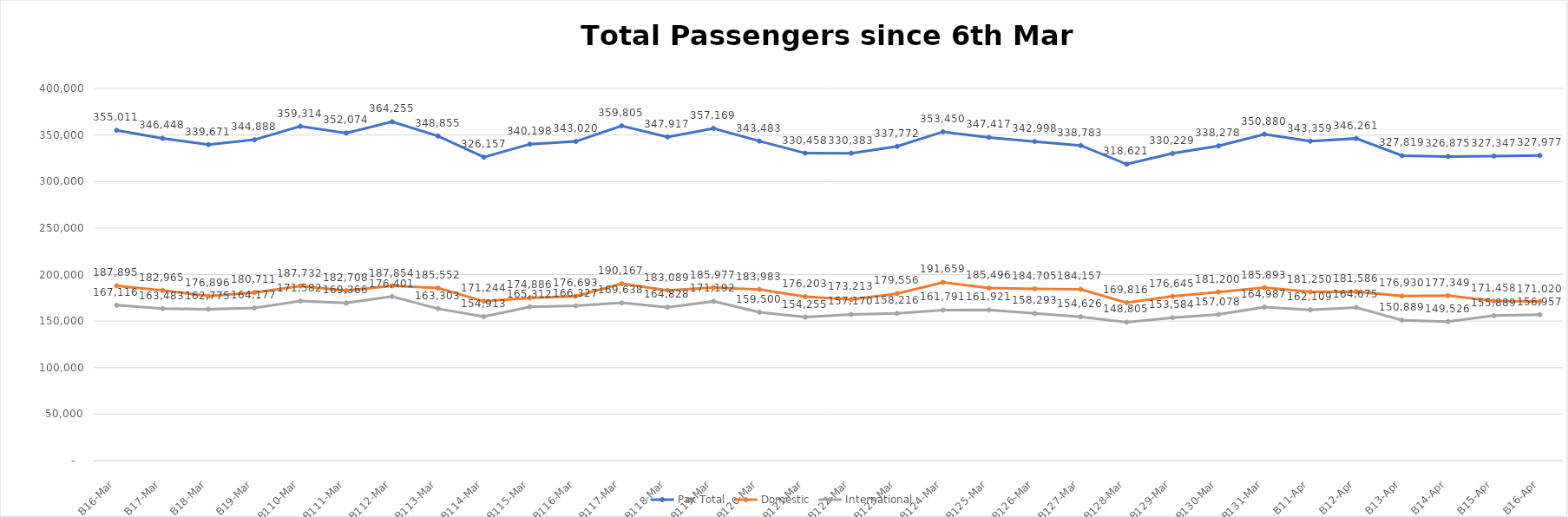
| Category | Pax Total |  Domestic  |  International  |
|---|---|---|---|
| 2023-03-06 | 355011 | 187895 | 167116 |
| 2023-03-07 | 346448 | 182965 | 163483 |
| 2023-03-08 | 339671 | 176896 | 162775 |
| 2023-03-09 | 344888 | 180711 | 164177 |
| 2023-03-10 | 359314 | 187732 | 171582 |
| 2023-03-11 | 352074 | 182708 | 169366 |
| 2023-03-12 | 364255 | 187854 | 176401 |
| 2023-03-13 | 348855 | 185552 | 163303 |
| 2023-03-14 | 326157 | 171244 | 154913 |
| 2023-03-15 | 340198 | 174886 | 165312 |
| 2023-03-16 | 343020 | 176693 | 166327 |
| 2023-03-17 | 359805 | 190167 | 169638 |
| 2023-03-18 | 347917 | 183089 | 164828 |
| 2023-03-19 | 357169 | 185977 | 171192 |
| 2023-03-20 | 343483 | 183983 | 159500 |
| 2023-03-21 | 330458 | 176203 | 154255 |
| 2023-03-22 | 330383 | 173213 | 157170 |
| 2023-03-23 | 337772 | 179556 | 158216 |
| 2023-03-24 | 353450 | 191659 | 161791 |
| 2023-03-25 | 347417 | 185496 | 161921 |
| 2023-03-26 | 342998 | 184705 | 158293 |
| 2023-03-27 | 338783 | 184157 | 154626 |
| 2023-03-28 | 318621 | 169816 | 148805 |
| 2023-03-29 | 330229 | 176645 | 153584 |
| 2023-03-30 | 338278 | 181200 | 157078 |
| 2023-03-31 | 350880 | 185893 | 164987 |
| 2023-04-01 | 343359 | 181250 | 162109 |
| 2023-04-02 | 346261 | 181586 | 164675 |
| 2023-04-03 | 327819 | 176930 | 150889 |
| 2023-04-04 | 326875 | 177349 | 149526 |
| 2023-04-05 | 327347 | 171458 | 155889 |
| 2023-04-06 | 327977 | 171020 | 156957 |